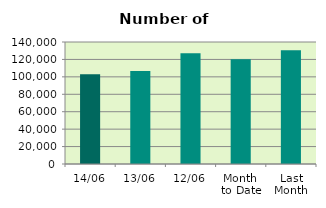
| Category | Series 0 |
|---|---|
| 14/06 | 102944 |
| 13/06 | 106798 |
| 12/06 | 127054 |
| Month 
to Date | 120068.4 |
| Last
Month | 130647.636 |